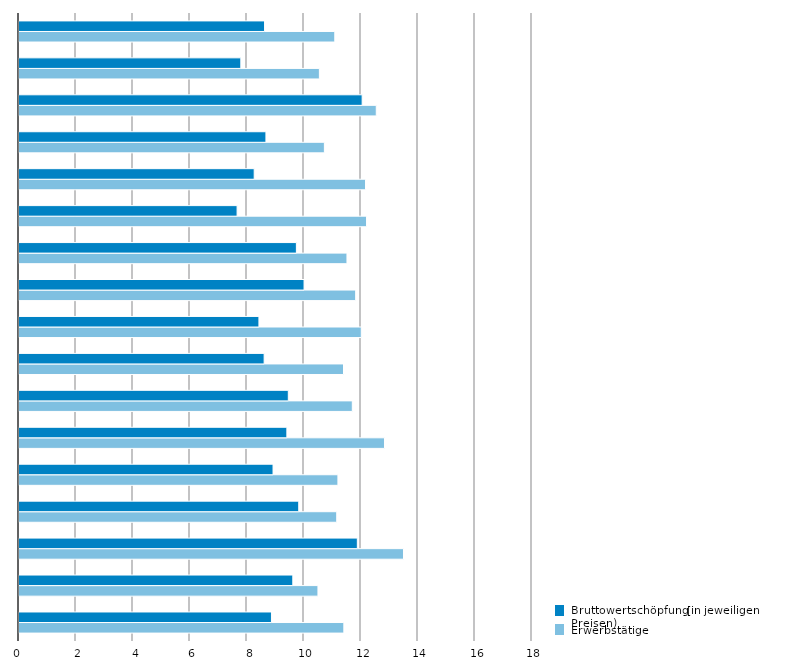
| Category | Erwerbstätige | Bruttowertschöpfung (in jeweiligen Preisen) |
|---|---|---|
| 0 | 11.398 | 8.858 |
| 1 | 10.489 | 9.607 |
| 2 | 13.491 | 11.871 |
| 3 | 11.148 | 9.815 |
| 4 | 11.19 | 8.913 |
| 5 | 12.824 | 9.399 |
| 6 | 11.695 | 9.449 |
| 7 | 11.386 | 8.601 |
| 8 | 12.011 | 8.418 |
| 9 | 11.813 | 10.002 |
| 10 | 11.508 | 9.732 |
| 11 | 12.194 | 7.652 |
| 12 | 12.159 | 8.252 |
| 13 | 10.715 | 8.664 |
| 14 | 12.536 | 12.04 |
| 15 | 10.54 | 7.783 |
| 16 | 11.08 | 8.616 |